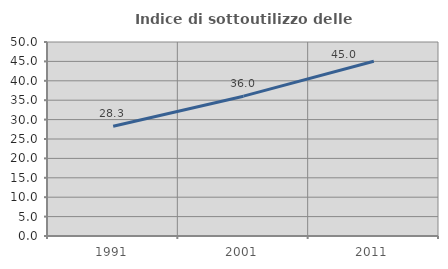
| Category | Indice di sottoutilizzo delle abitazioni  |
|---|---|
| 1991.0 | 28.276 |
| 2001.0 | 36.039 |
| 2011.0 | 45.024 |